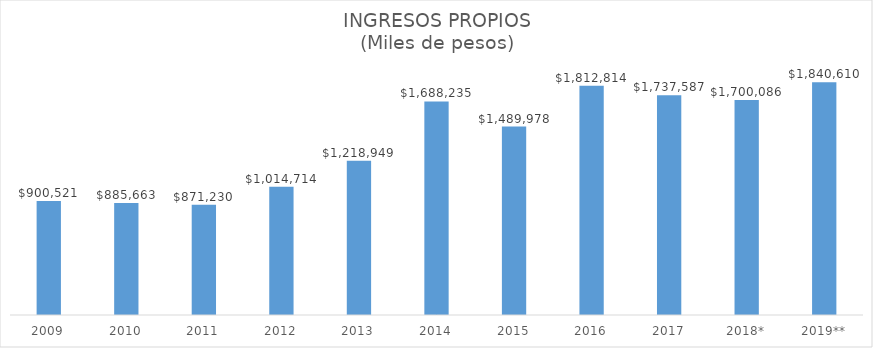
| Category | INGRESOS PROPIOS |
|---|---|
| 2009 | 900521 |
| 2010 | 885663 |
| 2011 | 871230 |
| 2012 | 1014714 |
| 2013 | 1218949 |
| 2014 | 1688235 |
| 2015 | 1489978 |
| 2016 | 1812814 |
| 2017 | 1737587 |
| 2018* | 1700086 |
| 2019** | 1840610 |